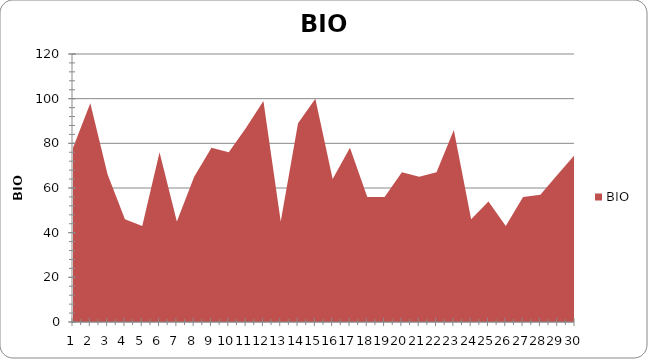
| Category | BIO |
|---|---|
| 0 | 78 |
| 1 | 98 |
| 2 | 66 |
| 3 | 46 |
| 4 | 43 |
| 5 | 76 |
| 6 | 45 |
| 7 | 65 |
| 8 | 78 |
| 9 | 76 |
| 10 | 87 |
| 11 | 99 |
| 12 | 45 |
| 13 | 89 |
| 14 | 100 |
| 15 | 64 |
| 16 | 78 |
| 17 | 56 |
| 18 | 56 |
| 19 | 67 |
| 20 | 65 |
| 21 | 67 |
| 22 | 86 |
| 23 | 46 |
| 24 | 54 |
| 25 | 43 |
| 26 | 56 |
| 27 | 57 |
| 28 | 66 |
| 29 | 75 |